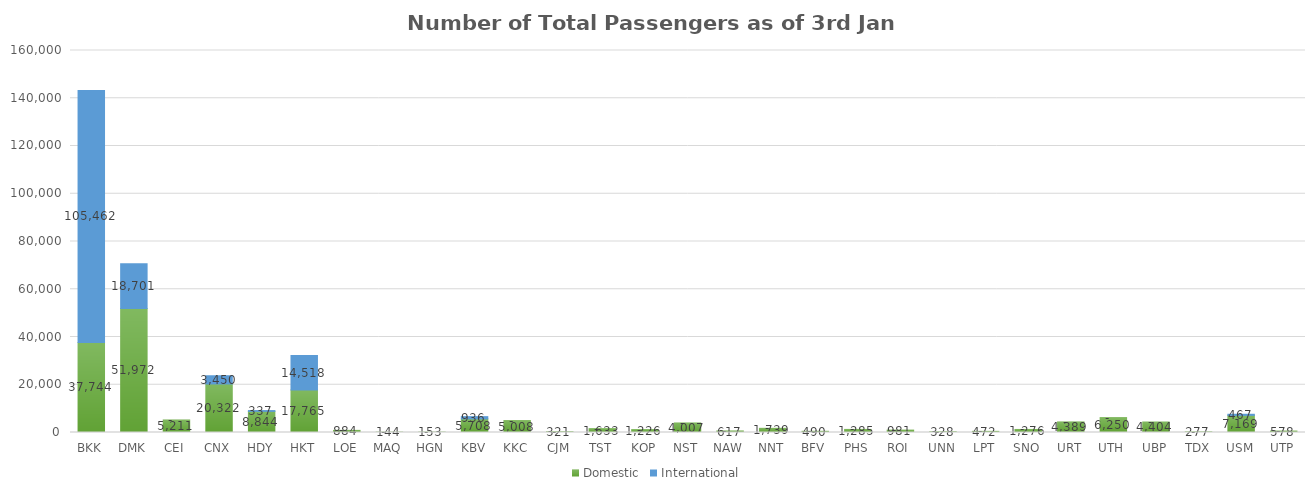
| Category | Domestic | International |
|---|---|---|
| BKK | 37744 | 105462 |
| DMK | 51972 | 18701 |
| CEI | 5211 | 0 |
| CNX | 20322 | 3450 |
| HDY | 8844 | 337 |
| HKT | 17765 | 14518 |
| LOE | 884 | 0 |
| MAQ | 144 | 0 |
| HGN | 153 | 0 |
| KBV | 5708 | 936 |
| KKC | 5008 | 0 |
| CJM | 321 | 0 |
| TST | 1633 | 0 |
| KOP | 1226 | 0 |
| NST | 4007 | 0 |
| NAW | 617 | 0 |
| NNT | 1739 | 0 |
| BFV | 490 | 0 |
| PHS | 1285 | 0 |
| ROI | 981 | 0 |
| UNN | 328 | 0 |
| LPT | 472 | 0 |
| SNO | 1276 | 0 |
| URT | 4389 | 0 |
| UTH | 6250 | 0 |
| UBP | 4404 | 0 |
| TDX | 277 | 0 |
| USM | 7169 | 467 |
| UTP | 578 | 0 |